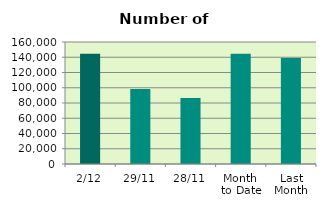
| Category | Series 0 |
|---|---|
| 2/12 | 144696 |
| 29/11 | 98338 |
| 28/11 | 86576 |
| Month 
to Date | 144696 |
| Last
Month | 138953.619 |